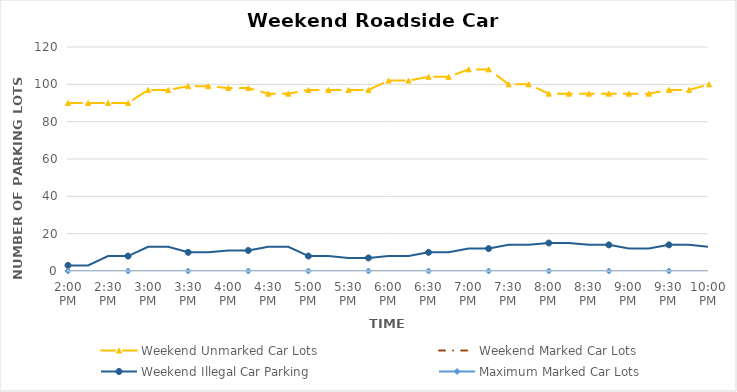
| Category | Weekend Unmarked Car Lots | Weekend Marked Car Lots | Weekend Illegal Car Parking | Maximum Marked Car Lots |
|---|---|---|---|---|
| 0.5833333333333334 | 90 | 0 | 3 | 0 |
| 0.59375 | 90 | 0 | 3 | 0 |
| 0.604166666666667 | 90 | 0 | 8 | 0 |
| 0.614583333333334 | 90 | 0 | 8 | 0 |
| 0.625 | 97 | 0 | 13 | 0 |
| 0.635416666666667 | 97 | 0 | 13 | 0 |
| 0.645833333333334 | 99 | 0 | 10 | 0 |
| 0.656250000000001 | 99 | 0 | 10 | 0 |
| 0.666666666666667 | 98 | 0 | 11 | 0 |
| 0.677083333333334 | 98 | 0 | 11 | 0 |
| 0.687500000000001 | 95 | 0 | 13 | 0 |
| 0.697916666666668 | 95 | 0 | 13 | 0 |
| 0.708333333333335 | 97 | 0 | 8 | 0 |
| 0.718750000000001 | 97 | 0 | 8 | 0 |
| 0.729166666666668 | 97 | 0 | 7 | 0 |
| 0.739583333333335 | 97 | 0 | 7 | 0 |
| 0.750000000000002 | 102 | 0 | 8 | 0 |
| 0.760416666666668 | 102 | 0 | 8 | 0 |
| 0.770833333333335 | 104 | 0 | 10 | 0 |
| 0.781250000000002 | 104 | 0 | 10 | 0 |
| 0.791666666666669 | 108 | 0 | 12 | 0 |
| 0.802083333333335 | 108 | 0 | 12 | 0 |
| 0.812500000000002 | 100 | 0 | 14 | 0 |
| 0.822916666666669 | 100 | 0 | 14 | 0 |
| 0.833333333333336 | 95 | 0 | 15 | 0 |
| 0.843750000000002 | 95 | 0 | 15 | 0 |
| 0.854166666666669 | 95 | 0 | 14 | 0 |
| 0.864583333333336 | 95 | 0 | 14 | 0 |
| 0.875000000000002 | 95 | 0 | 12 | 0 |
| 0.885416666666669 | 95 | 0 | 12 | 0 |
| 0.895833333333336 | 97 | 0 | 14 | 0 |
| 0.906250000000003 | 97 | 0 | 14 | 0 |
| 0.916666666666669 | 100 | 0 | 13 | 0 |